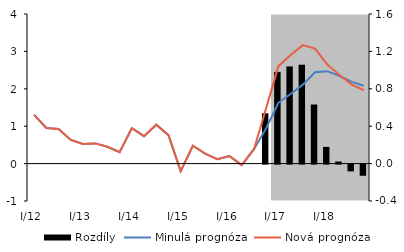
| Category | Rozdíly |
|---|---|
| 0 | 0 |
| 1 | 0 |
| 2 | 0 |
| 3 | 0 |
| 4 | 0 |
| 5 | 0 |
| 6 | 0 |
| 7 | 0 |
| 8 | 0 |
| 9 | 0 |
| 10 | 0 |
| 11 | 0 |
| 12 | 0 |
| 13 | 0 |
| 14 | 0 |
| 15 | 0 |
| 16 | 0 |
| 17 | 0 |
| 18 | 0 |
| 19 | 0.538 |
| 20 | 0.98 |
| 21 | 1.039 |
| 22 | 1.057 |
| 23 | 0.632 |
| 24 | 0.179 |
| 25 | 0.022 |
| 26 | -0.073 |
| 27 | -0.119 |